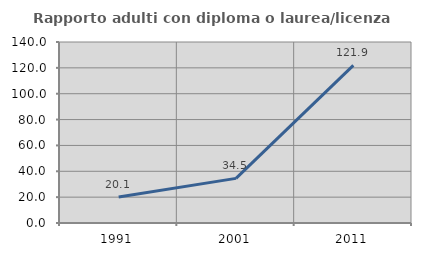
| Category | Rapporto adulti con diploma o laurea/licenza media  |
|---|---|
| 1991.0 | 20.074 |
| 2001.0 | 34.521 |
| 2011.0 | 121.898 |